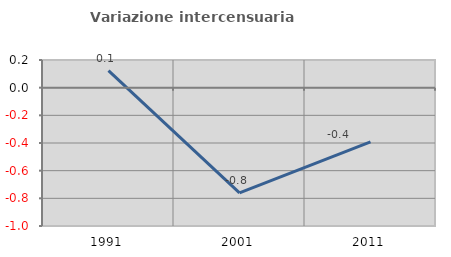
| Category | Variazione intercensuaria annua |
|---|---|
| 1991.0 | 0.123 |
| 2001.0 | -0.761 |
| 2011.0 | -0.392 |